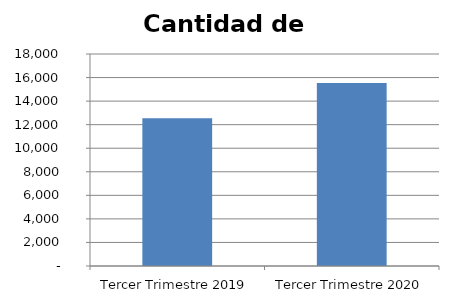
| Category | Cantidad de Préstamos  |
|---|---|
| Tercer Trimestre 2019 | 12542 |
| Tercer Trimestre 2020 | 15545 |